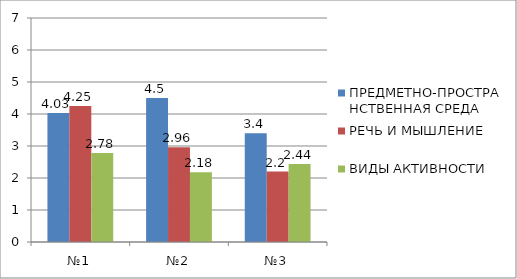
| Category | ПРЕДМЕТНО-ПРОСТРАНСТВЕННАЯ СРЕДА | РЕЧЬ И МЫШЛЕНИЕ | ВИДЫ АКТИВНОСТИ |
|---|---|---|---|
| №1 | 4.03 | 4.25 | 2.78 |
| №2 | 4.5 | 2.96 | 2.18 |
| №3 | 3.4 | 2.2 | 2.44 |